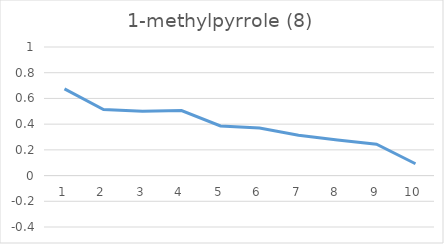
| Category | Series 0 |
|---|---|
| 0 | 0.674 |
| 1 | 0.514 |
| 2 | 0.5 |
| 3 | 0.506 |
| 4 | 0.386 |
| 5 | 0.37 |
| 6 | 0.314 |
| 7 | 0.276 |
| 8 | 0.244 |
| 9 | 0.092 |